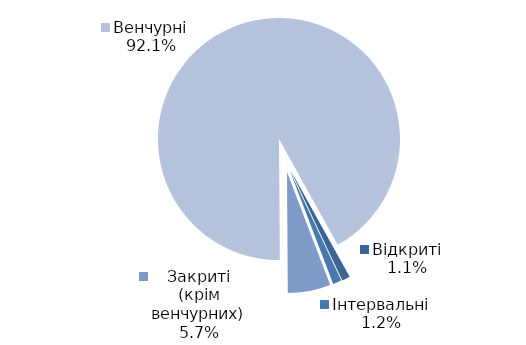
| Category | Series 0 |
|---|---|
| Відкриті | 17 |
| Інтервальні | 18 |
| Закриті (крім венчурних) | 89 |
| Венчурні | 1436 |